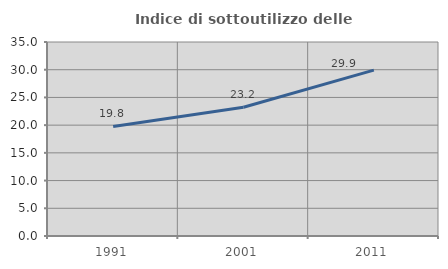
| Category | Indice di sottoutilizzo delle abitazioni  |
|---|---|
| 1991.0 | 19.762 |
| 2001.0 | 23.234 |
| 2011.0 | 29.932 |